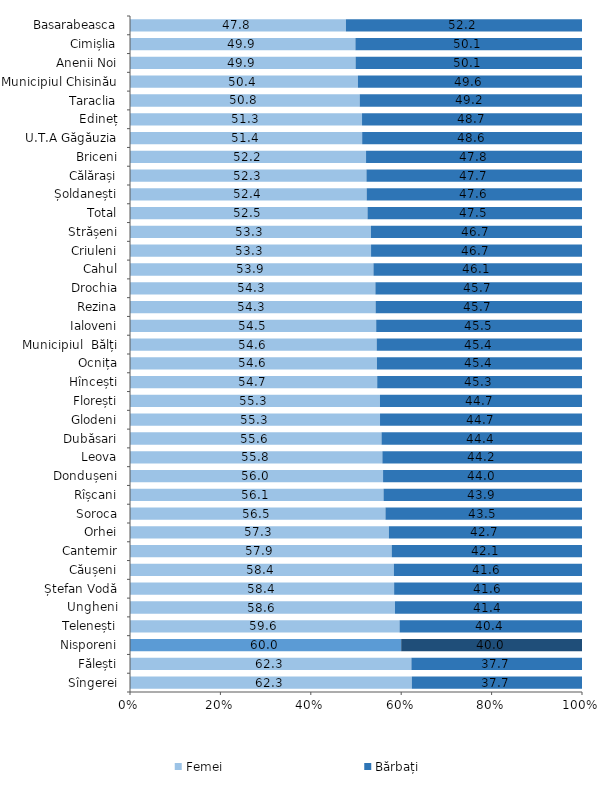
| Category | Femei | Bărbați |
|---|---|---|
| Sîngerei | 62.349 | 37.651 |
| Fălești | 62.254 | 37.746 |
| Nisporeni | 59.999 | 40.001 |
| Telenești | 59.634 | 40.366 |
| Ungheni | 58.625 | 41.375 |
| Ștefan Vodă | 58.435 | 41.565 |
| Căușeni | 58.377 | 41.623 |
| Cantemir | 57.904 | 42.096 |
| Orhei | 57.278 | 42.722 |
| Soroca | 56.516 | 43.484 |
| Rîșcani | 56.091 | 43.909 |
| Dondușeni | 55.988 | 44.012 |
| Leova | 55.835 | 44.165 |
| Dubăsari | 55.648 | 44.352 |
| Glodeni | 55.314 | 44.686 |
| Florești | 55.303 | 44.697 |
| Hîncești | 54.689 | 45.311 |
| Ocnița | 54.631 | 45.369 |
| Municipiul  Bălți | 54.579 | 45.421 |
| Ialoveni | 54.465 | 45.535 |
| Rezina | 54.338 | 45.662 |
| Drochia | 54.289 | 45.711 |
| Cahul | 53.862 | 46.138 |
| Criuleni | 53.33 | 46.67 |
| Strășeni | 53.303 | 46.697 |
| Total | 52.548 | 47.452 |
| Șoldanești | 52.362 | 47.638 |
| Călărași | 52.311 | 47.689 |
| Briceni | 52.222 | 47.778 |
| U.T.A Găgăuzia | 51.365 | 48.635 |
| Edineț | 51.334 | 48.666 |
| Taraclia | 50.823 | 49.177 |
| Municipiul Chisinău | 50.423 | 49.577 |
| Anenii Noi | 49.908 | 50.092 |
| Cimișlia | 49.868 | 50.132 |
| Basarabeasca | 47.774 | 52.226 |